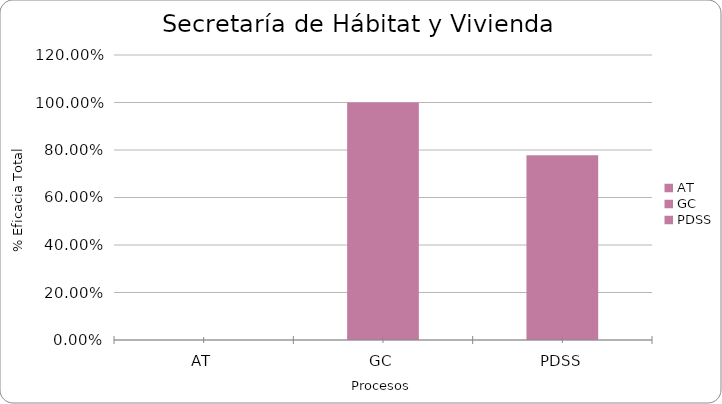
| Category | % Eficacia total |
|---|---|
| AT | 0 |
| GC | 1 |
| PDSS | 0.778 |